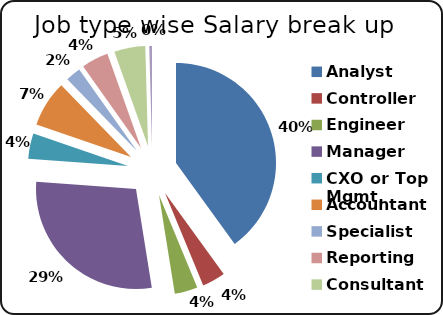
| Category | Series 0 |
|---|---|
| Analyst | 37535562.083 |
| Controller | 3505080.348 |
| Engineer | 3485573.09 |
| Manager | 26924451.7 |
| CXO or Top Mgmt. | 3831005.397 |
| Accountant | 7004235.907 |
| Specialist | 2313495.285 |
| Reporting | 4085452.539 |
| Consultant | 4707401.324 |
| Misc. | 408630.843 |